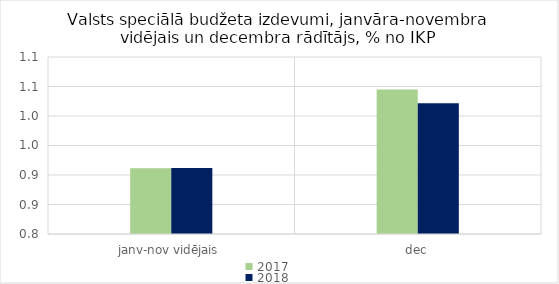
| Category | 2017 | 2018 |
|---|---|---|
| janv-nov vidējais | 0.911 | 0.912 |
| dec | 1.045 | 1.022 |